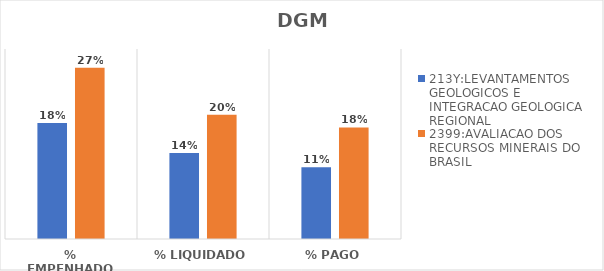
| Category | 213Y:LEVANTAMENTOS GEOLOGICOS E INTEGRACAO GEOLOGICA REGIONAL | 2399:AVALIACAO DOS RECURSOS MINERAIS DO BRASIL |
|---|---|---|
| % EMPENHADO | 0.183 | 0.27 |
| % LIQUIDADO | 0.136 | 0.196 |
| % PAGO | 0.113 | 0.176 |